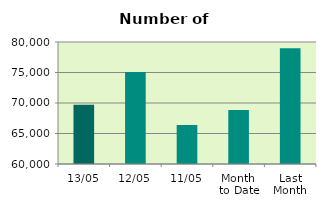
| Category | Series 0 |
|---|---|
| 13/05 | 69716 |
| 12/05 | 75098 |
| 11/05 | 66394 |
| Month 
to Date | 68840.25 |
| Last
Month | 78959.6 |